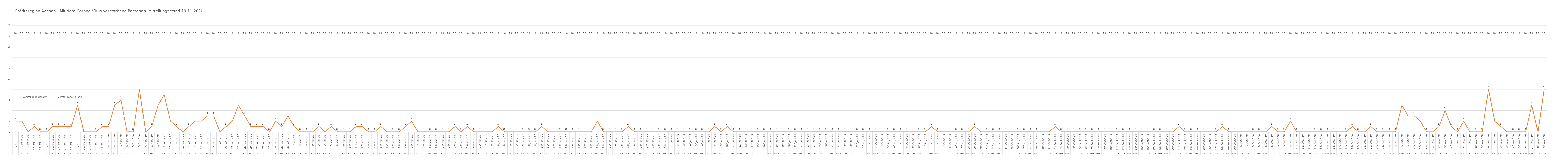
| Category | Verstorbene gesamt | Verstorbene Corona |
|---|---|---|
| 0 | 18 | 2 |
| 1 | 18 | 2 |
| 2 | 18 | 0 |
| 3 | 18 | 1 |
| 4 | 18 | 0 |
| 5 | 18 | 0 |
| 6 | 18 | 1 |
| 7 | 18 | 1 |
| 8 | 18 | 1 |
| 9 | 18 | 1 |
| 10 | 18 | 5 |
| 11 | 18 | 0 |
| 12 | 18 | 0 |
| 13 | 18 | 0 |
| 14 | 18 | 1 |
| 15 | 18 | 1 |
| 16 | 18 | 5 |
| 17 | 18 | 6 |
| 18 | 18 | 0 |
| 19 | 18 | 0 |
| 20 | 18 | 8 |
| 21 | 18 | 0 |
| 22 | 18 | 1 |
| 23 | 18 | 5 |
| 24 | 18 | 7 |
| 25 | 18 | 2 |
| 26 | 18 | 1 |
| 27 | 18 | 0 |
| 28 | 18 | 1 |
| 29 | 18 | 2 |
| 30 | 18 | 2 |
| 31 | 18 | 3 |
| 32 | 18 | 3 |
| 33 | 18 | 0 |
| 34 | 18 | 1 |
| 35 | 18 | 2 |
| 36 | 18 | 5 |
| 37 | 18 | 3 |
| 38 | 18 | 1 |
| 39 | 18 | 1 |
| 40 | 18 | 1 |
| 41 | 18 | 0 |
| 42 | 18 | 2 |
| 43 | 18 | 1 |
| 44 | 18 | 3 |
| 45 | 18 | 1 |
| 46 | 18 | 0 |
| 47 | 18 | 0 |
| 48 | 18 | 0 |
| 49 | 18 | 1 |
| 50 | 18 | 0 |
| 51 | 18 | 1 |
| 52 | 18 | 0 |
| 53 | 18 | 0 |
| 54 | 18 | 0 |
| 55 | 18 | 1 |
| 56 | 18 | 1 |
| 57 | 18 | 0 |
| 58 | 18 | 0 |
| 59 | 18 | 1 |
| 60 | 18 | 0 |
| 61 | 18 | 0 |
| 62 | 18 | 0 |
| 63 | 18 | 1 |
| 64 | 18 | 2 |
| 65 | 18 | 0 |
| 66 | 18 | 0 |
| 67 | 18 | 0 |
| 68 | 18 | 0 |
| 69 | 18 | 0 |
| 70 | 18 | 0 |
| 71 | 18 | 1 |
| 72 | 18 | 0 |
| 73 | 18 | 1 |
| 74 | 18 | 0 |
| 75 | 18 | 0 |
| 76 | 18 | 0 |
| 77 | 18 | 0 |
| 78 | 18 | 1 |
| 79 | 18 | 0 |
| 80 | 18 | 0 |
| 81 | 18 | 0 |
| 82 | 18 | 0 |
| 83 | 18 | 0 |
| 84 | 18 | 0 |
| 85 | 18 | 1 |
| 86 | 18 | 0 |
| 87 | 18 | 0 |
| 88 | 18 | 0 |
| 89 | 18 | 0 |
| 90 | 18 | 0 |
| 91 | 18 | 0 |
| 92 | 18 | 0 |
| 93 | 18 | 0 |
| 94 | 18 | 2 |
| 95 | 18 | 0 |
| 96 | 18 | 0 |
| 97 | 18 | 0 |
| 98 | 18 | 0 |
| 99 | 18 | 1 |
| 100 | 18 | 0 |
| 101 | 18 | 0 |
| 102 | 18 | 0 |
| 103 | 18 | 0 |
| 104 | 18 | 0 |
| 105 | 18 | 0 |
| 106 | 18 | 0 |
| 107 | 18 | 0 |
| 108 | 18 | 0 |
| 109 | 18 | 0 |
| 110 | 18 | 0 |
| 111 | 18 | 0 |
| 112 | 18 | 0 |
| 113 | 18 | 1 |
| 114 | 18 | 0 |
| 115 | 18 | 1 |
| 116 | 18 | 0 |
| 117 | 18 | 0 |
| 118 | 18 | 0 |
| 119 | 18 | 0 |
| 120 | 18 | 0 |
| 121 | 18 | 0 |
| 122 | 18 | 0 |
| 123 | 18 | 0 |
| 124 | 18 | 0 |
| 125 | 18 | 0 |
| 126 | 18 | 0 |
| 127 | 18 | 0 |
| 128 | 18 | 0 |
| 129 | 18 | 0 |
| 130 | 18 | 0 |
| 131 | 18 | 0 |
| 132 | 18 | 0 |
| 133 | 18 | 0 |
| 134 | 18 | 0 |
| 135 | 18 | 0 |
| 136 | 18 | 0 |
| 137 | 18 | 0 |
| 138 | 18 | 0 |
| 139 | 18 | 0 |
| 140 | 18 | 0 |
| 141 | 18 | 0 |
| 142 | 18 | 0 |
| 143 | 18 | 0 |
| 144 | 18 | 0 |
| 145 | 18 | 0 |
| 146 | 18 | 0 |
| 147 | 18 | 0 |
| 148 | 18 | 1 |
| 149 | 18 | 0 |
| 150 | 18 | 0 |
| 151 | 18 | 0 |
| 152 | 18 | 0 |
| 153 | 18 | 0 |
| 154 | 18 | 0 |
| 155 | 18 | 1 |
| 156 | 18 | 0 |
| 157 | 18 | 0 |
| 158 | 18 | 0 |
| 159 | 18 | 0 |
| 160 | 18 | 0 |
| 161 | 18 | 0 |
| 162 | 18 | 0 |
| 163 | 18 | 0 |
| 164 | 18 | 0 |
| 165 | 18 | 0 |
| 166 | 18 | 0 |
| 167 | 18 | 0 |
| 168 | 18 | 1 |
| 169 | 18 | 0 |
| 170 | 18 | 0 |
| 171 | 18 | 0 |
| 172 | 18 | 0 |
| 173 | 18 | 0 |
| 174 | 18 | 0 |
| 175 | 18 | 0 |
| 176 | 18 | 0 |
| 177 | 18 | 0 |
| 178 | 18 | 0 |
| 179 | 18 | 0 |
| 180 | 18 | 0 |
| 181 | 18 | 0 |
| 182 | 18 | 0 |
| 183 | 18 | 0 |
| 184 | 18 | 0 |
| 185 | 18 | 0 |
| 186 | 18 | 0 |
| 187 | 18 | 0 |
| 188 | 18 | 1 |
| 189 | 18 | 0 |
| 190 | 18 | 0 |
| 191 | 18 | 0 |
| 192 | 18 | 0 |
| 193 | 18 | 0 |
| 194 | 18 | 0 |
| 195 | 18 | 1 |
| 196 | 18 | 0 |
| 197 | 18 | 0 |
| 198 | 18 | 0 |
| 199 | 18 | 0 |
| 200 | 18 | 0 |
| 201 | 18 | 0 |
| 202 | 18 | 0 |
| 203 | 18 | 1 |
| 204 | 18 | 0 |
| 205 | 18 | 0 |
| 206 | 18 | 2 |
| 207 | 18 | 0 |
| 208 | 18 | 0 |
| 209 | 18 | 0 |
| 210 | 18 | 0 |
| 211 | 18 | 0 |
| 212 | 18 | 0 |
| 213 | 18 | 0 |
| 214 | 18 | 0 |
| 215 | 18 | 0 |
| 216 | 18 | 1 |
| 217 | 18 | 0 |
| 218 | 18 | 0 |
| 219 | 18 | 1 |
| 220 | 18 | 0 |
| 221 | 18 | 0 |
| 222 | 18 | 0 |
| 223 | 18 | 0 |
| 224 | 18 | 5 |
| 225 | 18 | 3 |
| 226 | 18 | 3 |
| 227 | 18 | 2 |
| 228 | 18 | 0 |
| 229 | 18 | 0 |
| 230 | 18 | 1 |
| 231 | 18 | 4 |
| 232 | 18 | 1 |
| 233 | 18 | 0 |
| 234 | 18 | 2 |
| 235 | 18 | 0 |
| 236 | 18 | 0 |
| 237 | 18 | 0 |
| 238 | 18 | 8 |
| 239 | 18 | 2 |
| 240 | 18 | 1 |
| 241 | 18 | 0 |
| 242 | 18 | 0 |
| 243 | 18 | 0 |
| 244 | 18 | 0 |
| 245 | 18 | 5 |
| 246 | 18 | 0 |
| 247 | 18 | 8 |